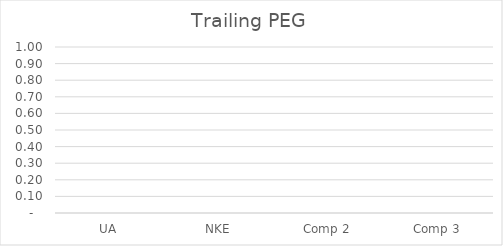
| Category | Trailing PEG |
|---|---|
| UA | 0 |
| NKE | 0 |
| Comp 2 | 0 |
| Comp 3 | 0 |